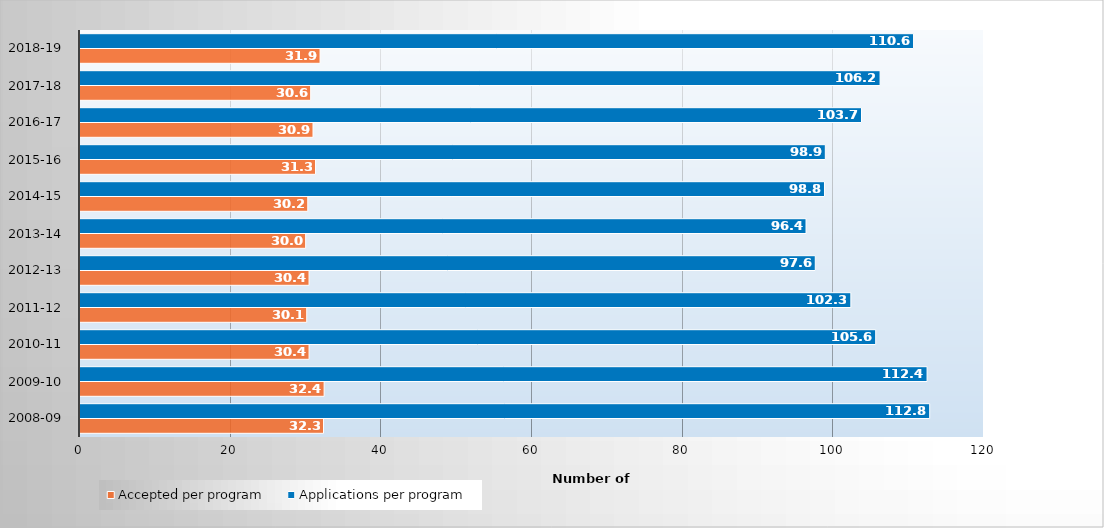
| Category | Accepted per program | Applications per program |
|---|---|---|
| 2008-09 | 32.326 | 112.791 |
| 2009-10 | 32.405 | 112.443 |
| 2010-11 | 30.406 | 105.625 |
| 2011-12 | 30.096 | 102.325 |
| 2012-13 | 30.403 | 97.603 |
| 2013-14 | 29.955 | 96.374 |
| 2014-15 | 30.236 | 98.827 |
| 2015-16 | 31.266 | 98.937 |
| 2016-17 | 30.93 | 103.739 |
| 2017-18 | 30.62 | 106.204 |
| 2018-19 | 31.865 | 110.649 |